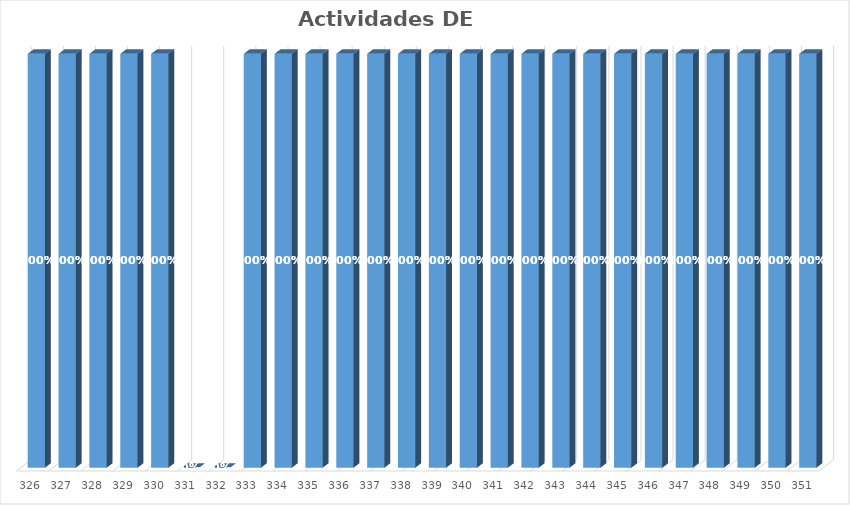
| Category | % Avance |
|---|---|
| 326.0 | 1 |
| 327.0 | 1 |
| 328.0 | 1 |
| 329.0 | 1 |
| 330.0 | 1 |
| 331.0 | 0 |
| 332.0 | 0 |
| 333.0 | 1 |
| 334.0 | 1 |
| 335.0 | 1 |
| 336.0 | 1 |
| 337.0 | 1 |
| 338.0 | 1 |
| 339.0 | 1 |
| 340.0 | 1 |
| 341.0 | 1 |
| 342.0 | 1 |
| 343.0 | 1 |
| 344.0 | 1 |
| 345.0 | 1 |
| 346.0 | 1 |
| 347.0 | 1 |
| 348.0 | 1 |
| 349.0 | 1 |
| 350.0 | 1 |
| 351.0 | 1 |